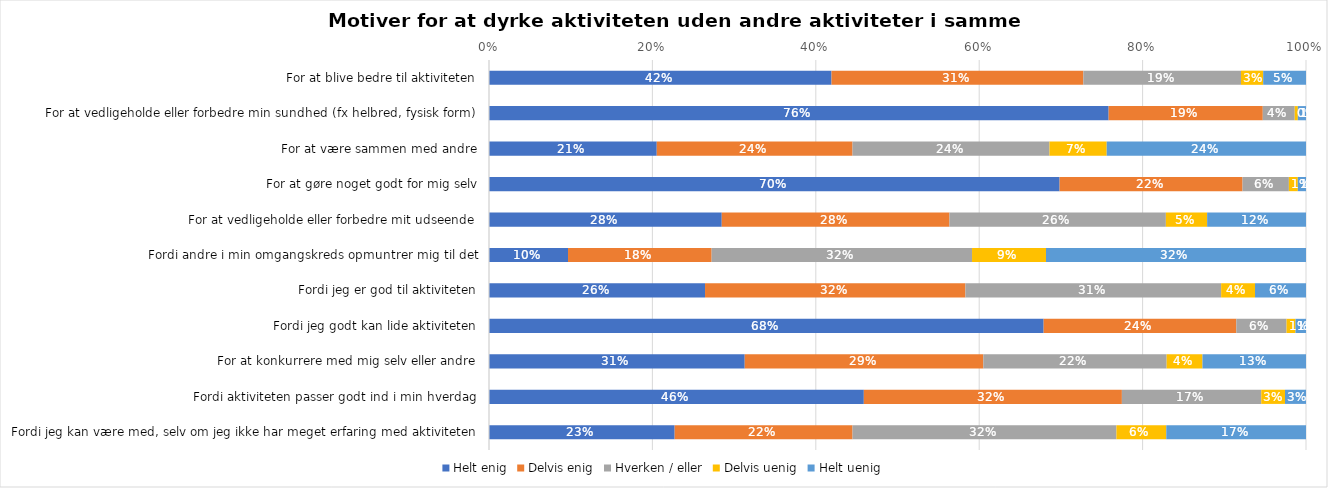
| Category | Helt enig | Delvis enig | Hverken / eller | Delvis uenig | Helt uenig |
|---|---|---|---|---|---|
| For at blive bedre til aktiviteten | 0.419 | 0.308 | 0.193 | 0.027 | 0.052 |
| For at vedligeholde eller forbedre min sundhed (fx helbred, fysisk form) | 0.758 | 0.189 | 0.039 | 0.004 | 0.01 |
| For at være sammen med andre | 0.205 | 0.24 | 0.241 | 0.07 | 0.244 |
| For at gøre noget godt for mig selv | 0.698 | 0.224 | 0.057 | 0.011 | 0.01 |
| For at vedligeholde eller forbedre mit udseende | 0.285 | 0.279 | 0.265 | 0.051 | 0.121 |
| Fordi andre i min omgangskreds opmuntrer mig til det | 0.097 | 0.176 | 0.319 | 0.091 | 0.318 |
| Fordi jeg er god til aktiviteten | 0.264 | 0.319 | 0.313 | 0.041 | 0.062 |
| Fordi jeg godt kan lide aktiviteten | 0.679 | 0.236 | 0.061 | 0.011 | 0.013 |
| For at konkurrere med mig selv eller andre | 0.313 | 0.292 | 0.224 | 0.044 | 0.127 |
| Fordi aktiviteten passer godt ind i min hverdag | 0.459 | 0.316 | 0.171 | 0.029 | 0.026 |
| Fordi jeg kan være med, selv om jeg ikke har meget erfaring med aktiviteten | 0.227 | 0.218 | 0.323 | 0.061 | 0.171 |